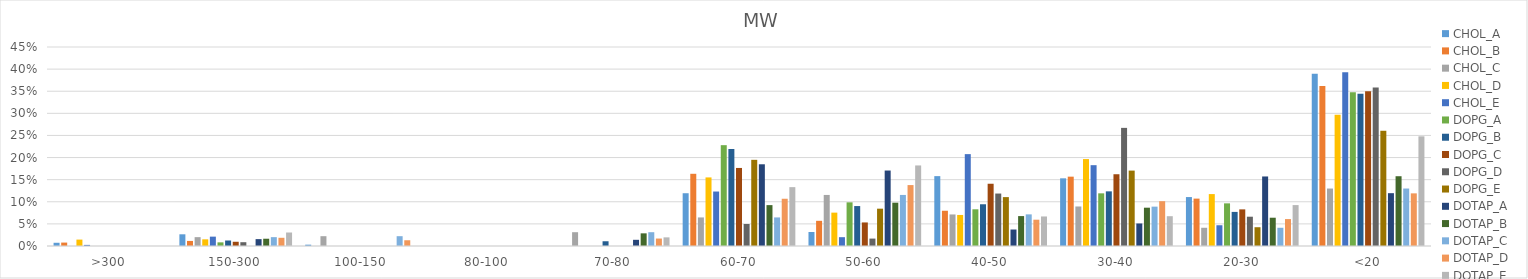
| Category | CHOL_A | CHOL_B | CHOL_C | CHOL_D | CHOL_E | DOPG_A | DOPG_B | DOPG_C | DOPG_D | DOPG_E | DOTAP_A | DOTAP_B | DOTAP_C | DOTAP_D | DOTAP_E |
|---|---|---|---|---|---|---|---|---|---|---|---|---|---|---|---|
| >300 | 0.007 | 0.008 | 0 | 0.014 | 0.003 | 0 | 0 | 0 | 0 | 0 | 0 | 0 | 0 | 0 | 0 |
| 150-300 | 0.026 | 0.011 | 0.02 | 0.015 | 0.021 | 0.008 | 0.012 | 0.01 | 0.009 | 0 | 0.016 | 0.016 | 0.02 | 0.019 | 0.031 |
| 100-150 | 0.003 | 0 | 0.022 | 0 | 0 | 0 | 0 | 0 | 0 | 0 | 0 | 0 | 0.022 | 0.013 | 0 |
| 80-100 | 0 | 0 | 0 | 0 | 0 | 0 | 0 | 0 | 0 | 0 | 0 | 0 | 0 | 0 | 0 |
| 70-80 | 0 | 0 | 0.031 | 0 | 0 | 0 | 0.011 | 0 | 0 | 0 | 0.014 | 0.029 | 0.031 | 0.017 | 0.02 |
| 60-70 | 0.119 | 0.163 | 0.065 | 0.155 | 0.123 | 0.228 | 0.219 | 0.176 | 0.05 | 0.195 | 0.185 | 0.092 | 0.065 | 0.107 | 0.133 |
| 50-60 | 0.032 | 0.057 | 0.115 | 0.075 | 0.02 | 0.099 | 0.09 | 0.053 | 0.017 | 0.084 | 0.171 | 0.098 | 0.115 | 0.138 | 0.182 |
| 40-50 | 0.158 | 0.08 | 0.071 | 0.07 | 0.208 | 0.083 | 0.094 | 0.141 | 0.119 | 0.111 | 0.037 | 0.068 | 0.072 | 0.059 | 0.067 |
| 30-40 | 0.153 | 0.157 | 0.089 | 0.197 | 0.183 | 0.119 | 0.124 | 0.162 | 0.267 | 0.171 | 0.051 | 0.087 | 0.089 | 0.101 | 0.067 |
| 20-30 | 0.111 | 0.107 | 0.041 | 0.117 | 0.047 | 0.096 | 0.077 | 0.083 | 0.066 | 0.042 | 0.157 | 0.064 | 0.041 | 0.061 | 0.093 |
| <20 | 0.389 | 0.362 | 0.13 | 0.297 | 0.393 | 0.348 | 0.344 | 0.35 | 0.359 | 0.261 | 0.119 | 0.158 | 0.13 | 0.119 | 0.248 |